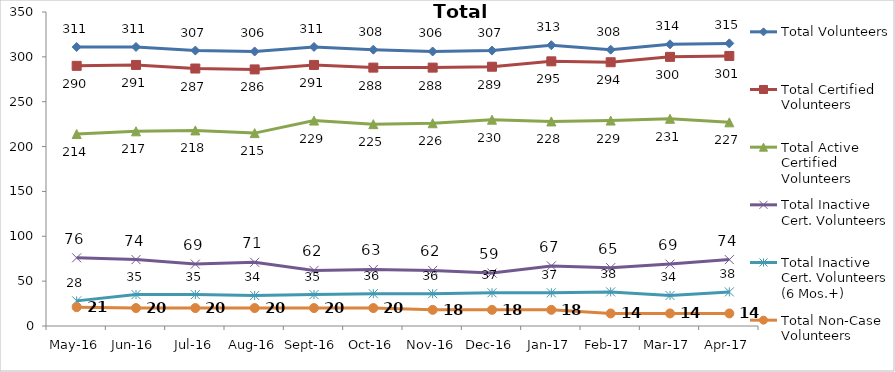
| Category | Total Volunteers | Total Certified Volunteers | Total Active Certified Volunteers | Total Inactive Cert. Volunteers | Total Inactive Cert. Volunteers (6 Mos.+) | Total Non-Case Volunteers |
|---|---|---|---|---|---|---|
| May-16 | 311 | 290 | 214 | 76 | 28 | 21 |
| Jun-16 | 311 | 291 | 217 | 74 | 35 | 20 |
| Jul-16 | 307 | 287 | 218 | 69 | 35 | 20 |
| Aug-16 | 306 | 286 | 215 | 71 | 34 | 20 |
| Sep-16 | 311 | 291 | 229 | 62 | 35 | 20 |
| Oct-16 | 308 | 288 | 225 | 63 | 36 | 20 |
| Nov-16 | 306 | 288 | 226 | 62 | 36 | 18 |
| Dec-16 | 307 | 289 | 230 | 59 | 37 | 18 |
| Jan-17 | 313 | 295 | 228 | 67 | 37 | 18 |
| Feb-17 | 308 | 294 | 229 | 65 | 38 | 14 |
| Mar-17 | 314 | 300 | 231 | 69 | 34 | 14 |
| Apr-17 | 315 | 301 | 227 | 74 | 38 | 14 |